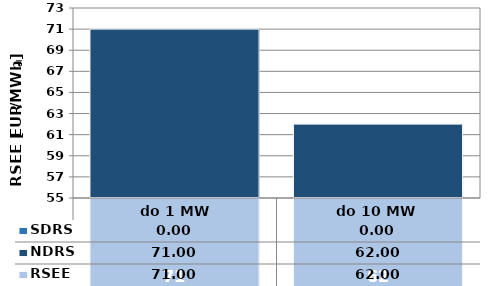
| Category | NDRS | SDRS |
|---|---|---|
|  do 1 MW | 71 | 0 |
| do 10 MW | 62 | 0 |